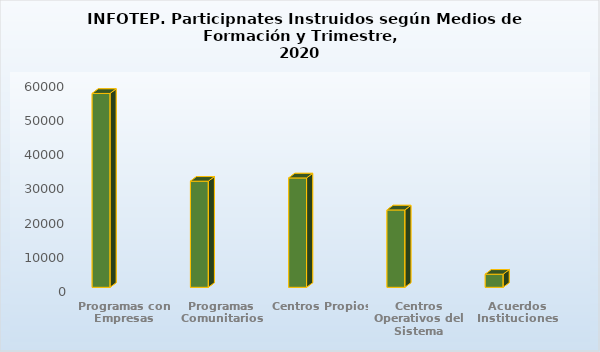
| Category | Enero - Marzo | Abril - Junio | Julio - Sept | Oct - Dic |
|---|---|---|---|---|
| Programas con Empresas | 56626 |  |  |  |
| Programas Comunitarios | 30999 |  |  |  |
| Centros Propios | 31945 |  |  |  |
| Centros Operativos del Sistema | 22599 |  |  |  |
| Acuerdos Instituciones | 3832 |  |  |  |